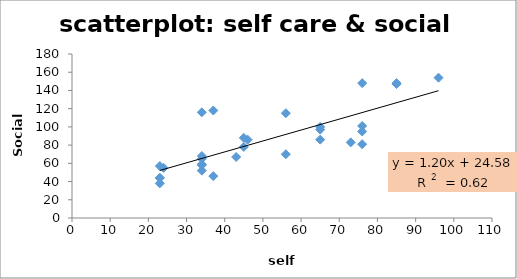
| Category | SSQ |
|---|---|
| 23.0 | 44 |
| 34.0 | 58 |
| 34.0 | 52 |
| 23.0 | 57 |
| 56.0 | 115 |
| 45.0 | 78 |
| 34.0 | 68 |
| 34.0 | 65 |
| 65.0 | 86 |
| 34.0 | 116 |
| 23.0 | 44 |
| 43.0 | 67 |
| 37.0 | 46 |
| 37.0 | 118 |
| 85.0 | 147 |
| 65.0 | 100 |
| 76.0 | 101 |
| 85.0 | 148 |
| 56.0 | 70 |
| 76.0 | 95 |
| 45.0 | 88 |
| 65.0 | 97 |
| 76.0 | 148 |
| 24.0 | 55 |
| 34.0 | 59 |
| 76.0 | 81 |
| 23.0 | 38 |
| 73.0 | 83 |
| 96.0 | 154 |
| 46.0 | 86 |